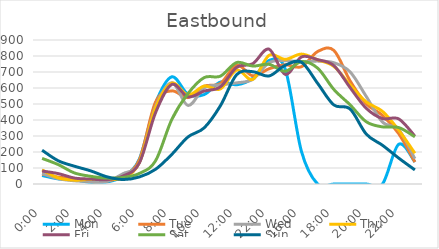
| Category | Mon | Tue | Wed | Thu | Fri | Sat | Sun |
|---|---|---|---|---|---|---|---|
| 0.0 | 53 | 62 | 66 | 88 | 81 | 160 | 211 |
| 0.041667 | 32 | 43 | 33 | 38 | 65 | 121 | 145 |
| 0.083333 | 26 | 33 | 20 | 24 | 37 | 69 | 111 |
| 0.125 | 10 | 14 | 16 | 29 | 31 | 48 | 82 |
| 0.166667 | 13 | 18 | 17 | 29 | 27 | 37 | 45 |
| 0.208333 | 48 | 52 | 65 | 38 | 50 | 41 | 28 |
| 0.25 | 156 | 151 | 133 | 135 | 132 | 66 | 44 |
| 0.291667 | 505 | 512 | 484 | 476 | 446 | 145 | 92 |
| 0.333333 | 670 | 582 | 633 | 630 | 622 | 403 | 185 |
| 0.375 | 561 | 540 | 491 | 557 | 545 | 565 | 294 |
| 0.416667 | 559 | 611 | 601 | 612 | 581 | 665 | 351 |
| 0.458333 | 637 | 628 | 619 | 594 | 607 | 674 | 489 |
| 0.5 | 620 | 743 | 632 | 712 | 729 | 759 | 683 |
| 0.541667 | 661 | 676 | 654 | 654 | 752 | 737 | 702 |
| 1900-01-02 22:00:00 | 772 | 720 | 758 | 804 | 843 | 748 | 675 |
| 0.625 | 718 | 745 | 771 | 779 | 685 | 705 | 742 |
| 0.666667 | 204 | 733 | 763 | 812 | 794 | 765 | 761 |
| 0.708333 | 0 | 828 | 768 | 776 | 777 | 724 | 629 |
| 0.75 | 0 | 835 | 758 | 735 | 740 | 591 | 494 |
| 0.791667 | 0 | 645 | 701 | 620 | 603 | 495 | 469 |
| 0.833333 | 0 | 501 | 547 | 513 | 473 | 389 | 312 |
| 0.875 | 0 | 429 | 387 | 454 | 409 | 357 | 242 |
| 0.916667 | 248 | 315 | 340 | 337 | 407 | 353 | 162 |
| 0.958333 | 138 | 137 | 158 | 192 | 299 | 295 | 88 |